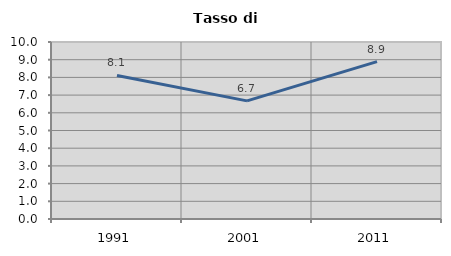
| Category | Tasso di disoccupazione   |
|---|---|
| 1991.0 | 8.108 |
| 2001.0 | 6.674 |
| 2011.0 | 8.891 |